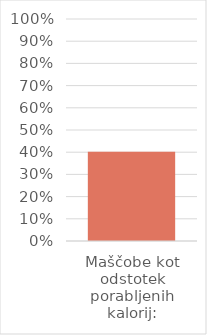
| Category | Series 0 |
|---|---|
| Maščobe kot odstotek porabljenih kalorij: | 0.402 |